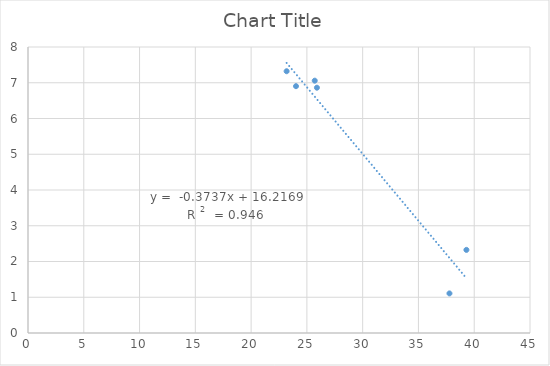
| Category | Series 0 |
|---|---|
| 23.183333333333334 | 7.322 |
| 24.023333333333337 | 6.905 |
| 25.703333333333333 | 7.058 |
| 25.900000000000002 | 6.862 |
| 39.300000000000004 | 2.325 |
| 37.78 | 1.107 |